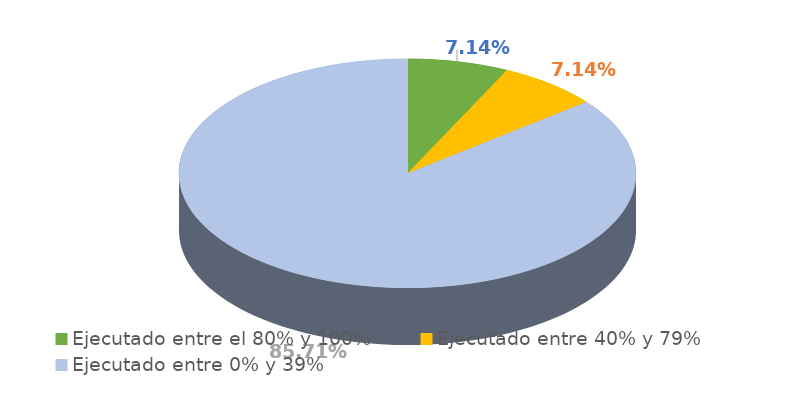
| Category | Series 0 |
|---|---|
| Ejecutado entre el 80% y 100% | 0.071 |
| Ejecutado entre 40% y 79% | 0.071 |
| Ejecutado entre 0% y 39% | 0.857 |